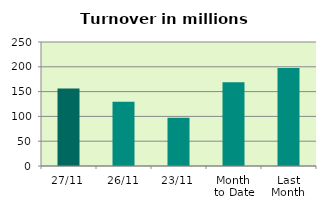
| Category | Series 0 |
|---|---|
| 27/11 | 156.196 |
| 26/11 | 129.648 |
| 23/11 | 97.066 |
| Month 
to Date | 168.779 |
| Last
Month | 197.652 |